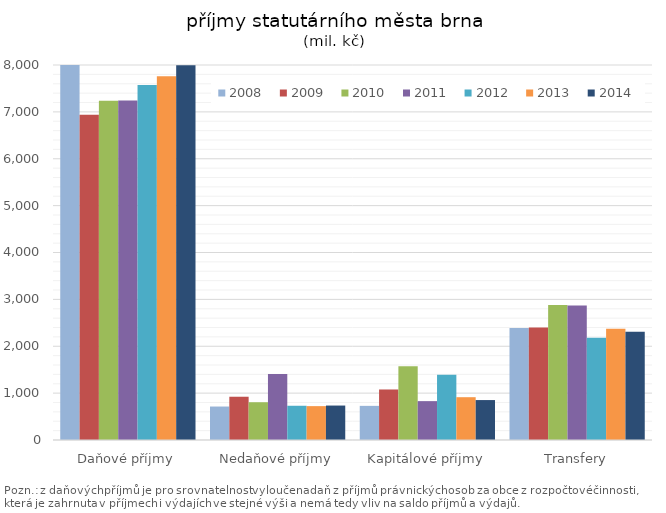
| Category | 2008 | 2009 | 2010 | 2011 | 2012 | 2013 | 2014 |
|---|---|---|---|---|---|---|---|
| Daňové příjmy | 8030.3 | 6936.6 | 7235 | 7242.1 | 7571.9 | 7762.2 | 7994 |
| Nedaňové příjmy | 713.9 | 923 | 805.9 | 1406.9 | 730.5 | 722.8 | 735 |
| Kapitálové příjmy | 728.4 | 1077.8 | 1575.6 | 829.3 | 1391.3 | 913.1 | 852 |
| Transfery | 2391.1 | 2399 | 2882.1 | 2869.7 | 2182.4 | 2374.4 | 2312 |